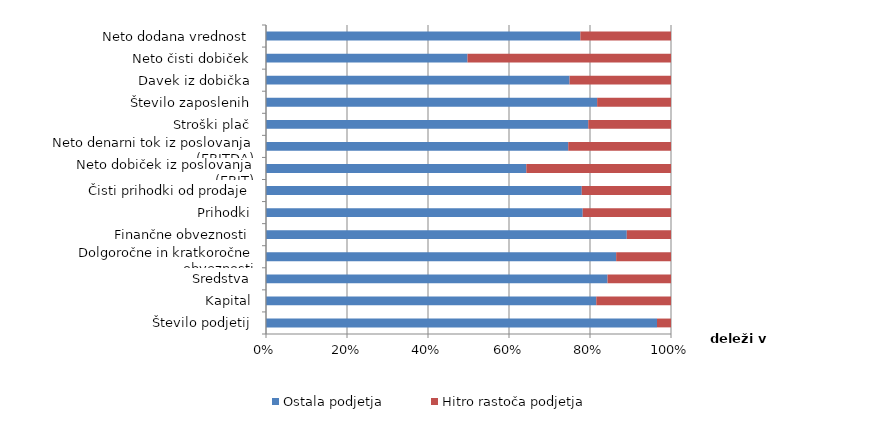
| Category | Ostala podjetja | Hitro rastoča podjetja |
|---|---|---|
| Število podjetij | 131678 | 4709 |
| Kapital | 38713655 | 8758400 |
| Sredstva | 91367477 | 16976875 |
| Dolgoročne in kratkoročne obveznosti | 52447532 | 8214671 |
| Finančne obveznosti | 30721244 | 3764592 |
| Prihodki | 82305044 | 22936431 |
| Čisti prihodki od prodaje | 79337835 | 22421686 |
| Neto dobiček iz poslovanja (EBIT) | 2849116 | 1583668 |
| Neto denarni tok iz poslovanja (EBITDA) | 7414486 | 2521143 |
| Stroški plač | 8033095 | 2062185 |
| Število zaposlenih | 465793 | 103888 |
| Davek iz dobička | 422503 | 141187 |
| Neto čisti dobiček | 1254357 | 1266900 |
| Neto dodana vrednost | 18449957 | 5318399 |